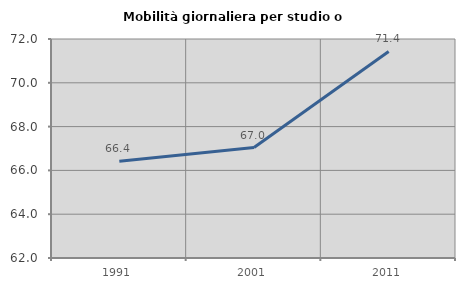
| Category | Mobilità giornaliera per studio o lavoro |
|---|---|
| 1991.0 | 66.417 |
| 2001.0 | 67.044 |
| 2011.0 | 71.433 |